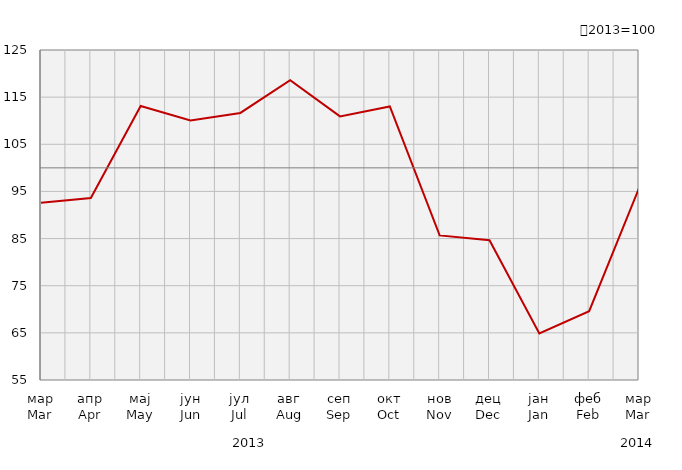
| Category | Индекси ноћења туриста
Tourist night indices |
|---|---|
| мар
Mar | 92.617 |
| апр
Apr | 93.597 |
| мај
May | 113.125 |
| јун
Jun | 110.07 |
| јул
Jul | 111.646 |
| авг
Aug | 118.578 |
| сеп
Sep | 110.922 |
| окт
Oct | 113.026 |
| нов
Nov | 85.665 |
| дец
Dec | 84.657 |
| јан
Jan | 64.882 |
| феб
Feb | 69.586 |
| мар
Mar | 95.7 |